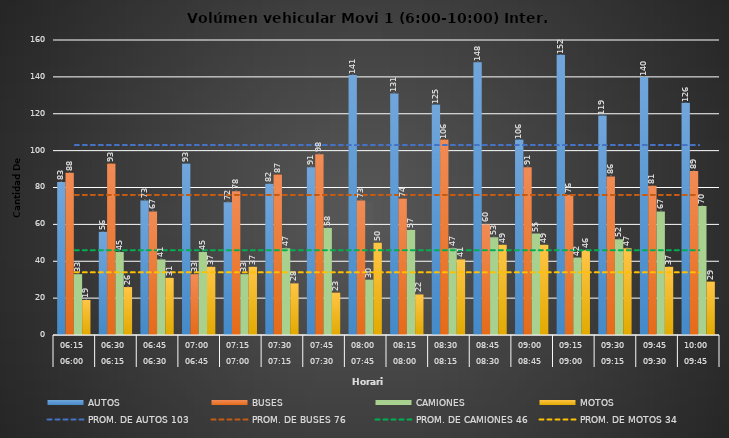
| Category | AUTOS | BUSES | CAMIONES | MOTOS |
|---|---|---|---|---|
| 0 | 83 | 88 | 33 | 19 |
| 1 | 56 | 93 | 45 | 26 |
| 2 | 73 | 67 | 41 | 31 |
| 3 | 93 | 33 | 45 | 37 |
| 4 | 72 | 78 | 33 | 37 |
| 5 | 82 | 87 | 47 | 28 |
| 6 | 91 | 98 | 58 | 23 |
| 7 | 141 | 73 | 30 | 50 |
| 8 | 131 | 74 | 57 | 22 |
| 9 | 125 | 106 | 47 | 41 |
| 10 | 148 | 60 | 53 | 49 |
| 11 | 106 | 91 | 55 | 49 |
| 12 | 152 | 76 | 42 | 46 |
| 13 | 119 | 86 | 52 | 47 |
| 14 | 140 | 81 | 67 | 37 |
| 15 | 126 | 89 | 70 | 29 |